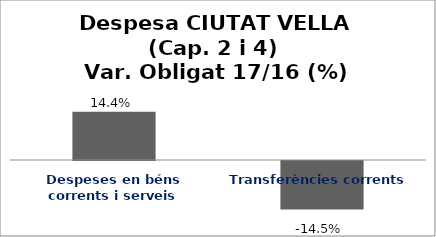
| Category | Series 0 |
|---|---|
| Despeses en béns corrents i serveis | 0.144 |
| Transferències corrents | -0.145 |